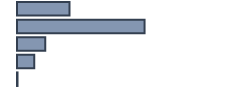
| Category | Series 0 |
|---|---|
| 0 | 23.23 |
| 1 | 56.441 |
| 2 | 12.474 |
| 3 | 7.626 |
| 4 | 0.23 |